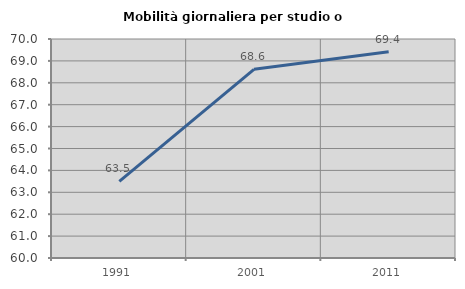
| Category | Mobilità giornaliera per studio o lavoro |
|---|---|
| 1991.0 | 63.496 |
| 2001.0 | 68.615 |
| 2011.0 | 69.414 |